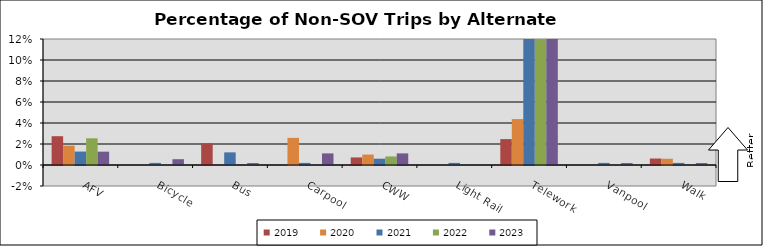
| Category | 2019 | 2020 | 2021 | 2022 | 2023 |
|---|---|---|---|---|---|
| AFV | 0.027 | 0.018 | 0.013 | 0.025 | 0.013 |
| Bicycle | 0 | 0 | 0.002 | 0 | 0.006 |
| Bus | 0.021 | 0 | 0.012 | 0 | 0.002 |
| Carpool | 0 | 0.026 | 0.002 | 0 | 0.011 |
| CWW | 0.007 | 0.01 | 0.006 | 0.008 | 0.011 |
| Light Rail | 0 | 0 | 0.002 | 0 | 0 |
| Telework | 0.025 | 0.044 | 0.577 | 0.613 | 0.683 |
| Vanpool | 0 | 0 | 0.002 | 0 | 0.002 |
| Walk | 0.006 | 0.006 | 0.002 | 0 | 0.002 |